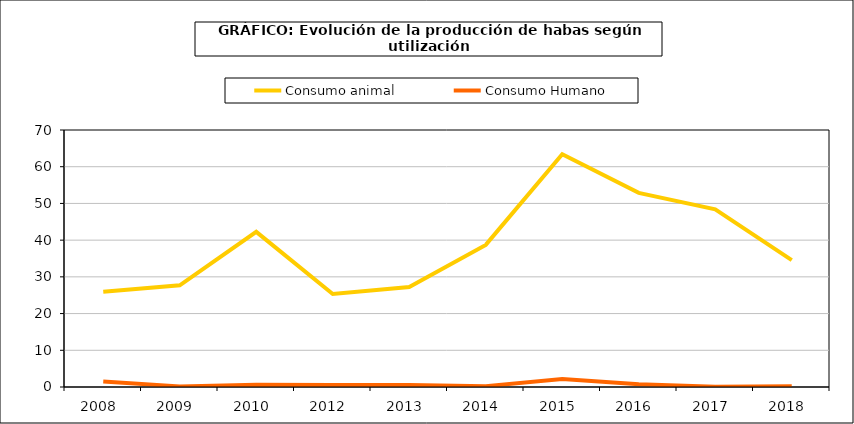
| Category | Consumo animal | Consumo Humano |
|---|---|---|
| 2008  | 25.955 | 1.505 |
| 2009  | 27.701 | 0.165 |
| 2010  | 42.262 | 0.62 |
| 2012  | 25.317 | 0.571 |
| 2013  | 27.212 | 0.547 |
| 2014  | 38.703 | 0.238 |
| 2015  | 63.379 | 2.153 |
| 2016  | 52.865 | 0.76 |
| 2017  | 48.372 | 0.096 |
| 2018  | 34.561 | 0.189 |